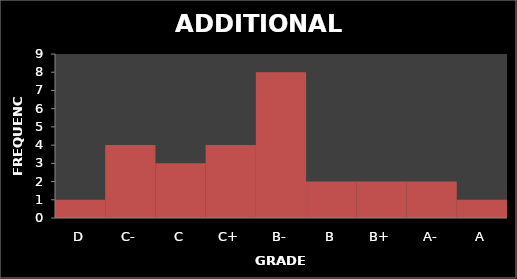
| Category | Series 0 |
|---|---|
| D | 1 |
| C- | 4 |
| C | 3 |
| C+ | 4 |
| B- | 8 |
| B | 2 |
| B+ | 2 |
| A- | 2 |
| A | 1 |